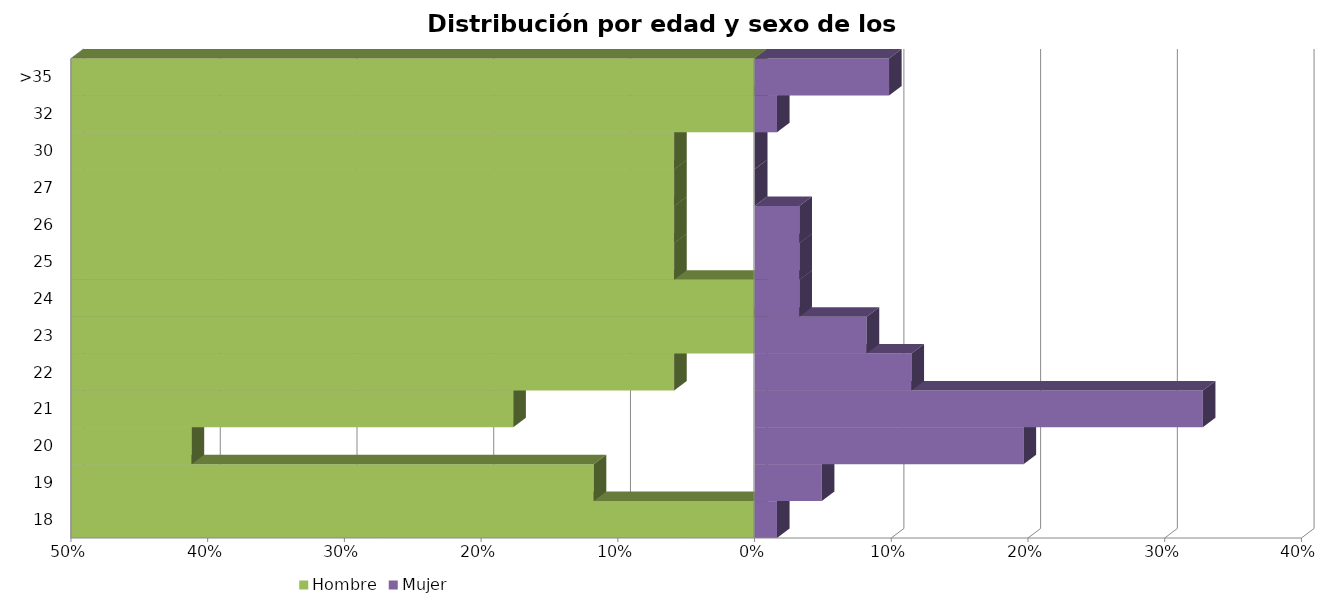
| Category | Hombre | Mujer |
|---|---|---|
| 18 | 0 | 0.016 |
| 19 | -0.118 | 0.049 |
| 20 | -0.412 | 0.197 |
| 21 | -0.176 | 0.328 |
| 22 | -0.059 | 0.115 |
| 23 | 0 | 0.082 |
| 24 | 0 | 0.033 |
| 25 | -0.059 | 0.033 |
| 26 | -0.059 | 0.033 |
| 27 | -0.059 | 0 |
| 30 | -0.059 | 0 |
| 32 | 0 | 0.016 |
| >35 | 0 | 0.098 |